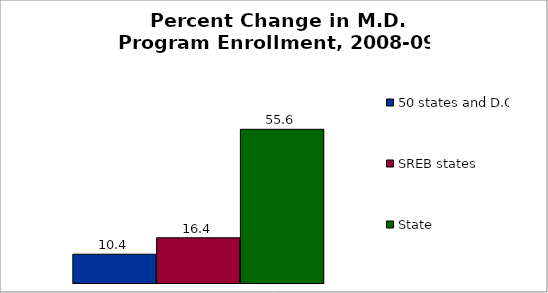
| Category | 50 states and D.C. | SREB states | State |
|---|---|---|---|
| 0 | 10.423 | 16.362 | 55.644 |